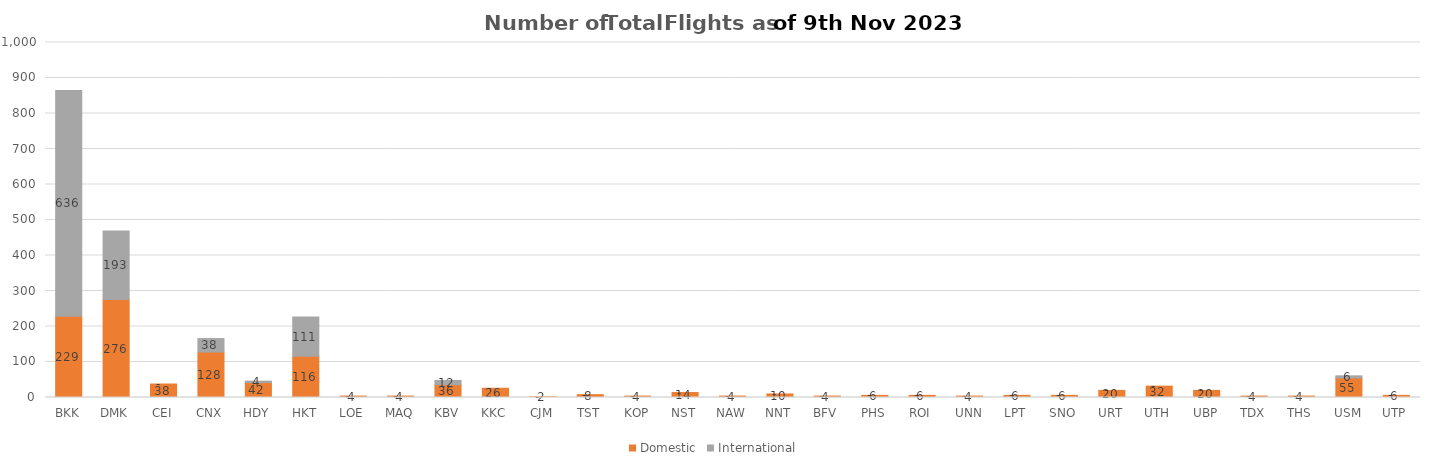
| Category | Domestic | International |
|---|---|---|
| BKK | 229 | 636 |
| DMK | 276 | 193 |
| CEI | 38 | 0 |
| CNX | 128 | 38 |
| HDY | 42 | 4 |
| HKT | 116 | 111 |
| LOE | 4 | 0 |
| MAQ | 4 | 0 |
| KBV | 36 | 12 |
| KKC | 26 | 0 |
| CJM | 2 | 0 |
| TST | 8 | 0 |
| KOP | 4 | 0 |
| NST | 14 | 0 |
| NAW | 4 | 0 |
| NNT | 10 | 0 |
| BFV | 4 | 0 |
| PHS | 6 | 0 |
| ROI | 6 | 0 |
| UNN | 4 | 0 |
| LPT | 6 | 0 |
| SNO | 6 | 0 |
| URT | 20 | 0 |
| UTH | 32 | 0 |
| UBP | 20 | 0 |
| TDX | 4 | 0 |
| THS | 4 | 0 |
| USM | 55 | 6 |
| UTP | 6 | 0 |